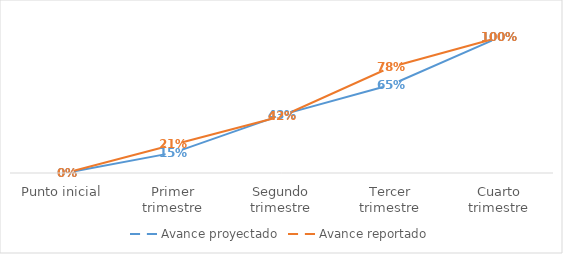
| Category | Avance proyectado | Avance reportado |
|---|---|---|
| Punto inicial | 0 | 0 |
| Primer trimestre | 0.15 | 0.21 |
| Segundo trimestre | 0.43 | 0.42 |
| Tercer trimestre | 0.65 | 0.78 |
| Cuarto trimestre | 1 | 1 |